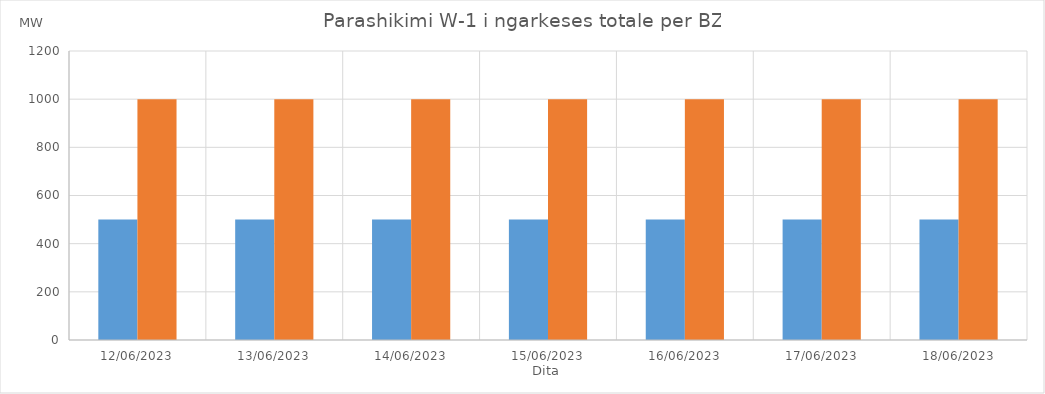
| Category | Min (MW) | Max (MW) |
|---|---|---|
| 12/06/2023 | 500 | 1000 |
| 13/06/2023 | 500 | 1000 |
| 14/06/2023 | 500 | 1000 |
| 15/06/2023 | 500 | 1000 |
| 16/06/2023 | 500 | 1000 |
| 17/06/2023 | 500 | 1000 |
| 18/06/2023 | 500 | 1000 |